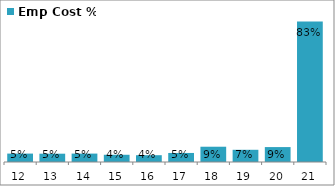
| Category | Emp Cost % |
|---|---|
| 2012-03-31 | 0.05 |
| 2013-03-31 | 0.049 |
| 2014-03-31 | 0.05 |
| 2015-03-31 | 0.043 |
| 2016-03-31 | 0.04 |
| 2017-03-31 | 0.054 |
| 2018-03-31 | 0.09 |
| 2019-03-31 | 0.072 |
| 2020-03-31 | 0.088 |
| 2021-03-31 | 0.832 |